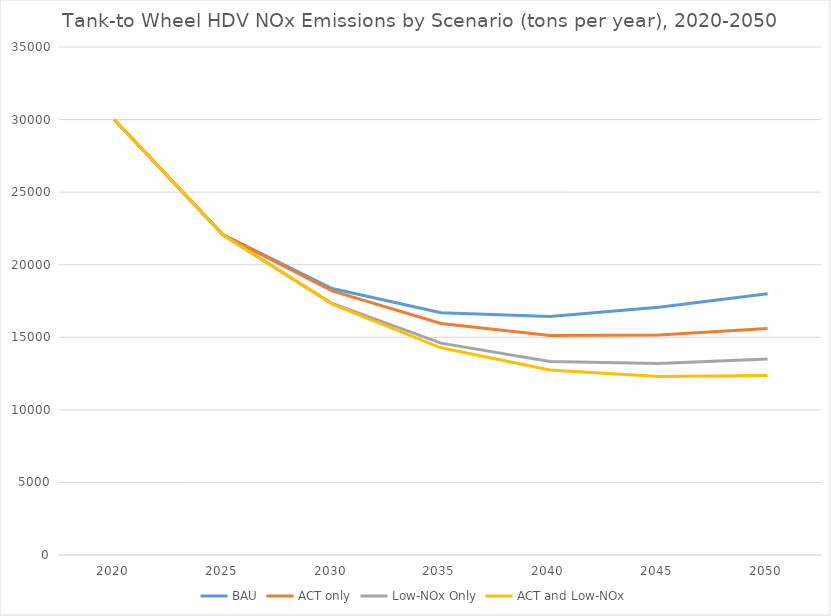
| Category | BAU | ACT only | Low-NOx Only | ACT and Low-NOx |
|---|---|---|---|---|
| 2020.0 | 29987.417 | 29987.417 | 29987.417 | 29987.417 |
| 2025.0 | 22051.592 | 22051.592 | 22023.864 | 22025.386 |
| 2030.0 | 18357.858 | 18194.067 | 17333.755 | 17286.052 |
| 2035.0 | 16684.393 | 15947.146 | 14595.606 | 14274.567 |
| 2040.0 | 16436.711 | 15115.678 | 13332.228 | 12744.415 |
| 2045.0 | 17064.405 | 15158.056 | 13188.101 | 12300.698 |
| 2050.0 | 18006.273 | 15606.96 | 13497.289 | 12360.752 |